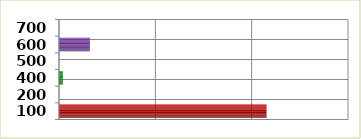
| Category | Series 0 |
|---|---|
| 100.0 | 2154600 |
| 200.0 | 0 |
| 400.0 | 40000 |
| 500.0 | 0 |
| 600.0 | 320635 |
| 700.0 | 0 |